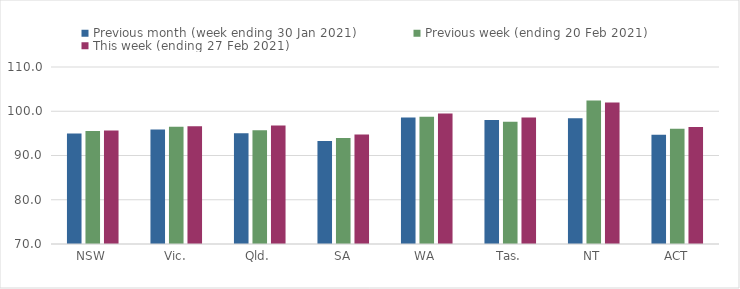
| Category | Previous month (week ending 30 Jan 2021) | Previous week (ending 20 Feb 2021) | This week (ending 27 Feb 2021) |
|---|---|---|---|
| NSW | 94.96 | 95.51 | 95.65 |
| Vic. | 95.89 | 96.49 | 96.59 |
| Qld. | 95.04 | 95.72 | 96.8 |
| SA | 93.29 | 93.96 | 94.77 |
| WA | 98.57 | 98.74 | 99.48 |
| Tas. | 98.04 | 97.6 | 98.6 |
| NT | 98.44 | 102.41 | 102 |
| ACT | 94.71 | 96.03 | 96.42 |